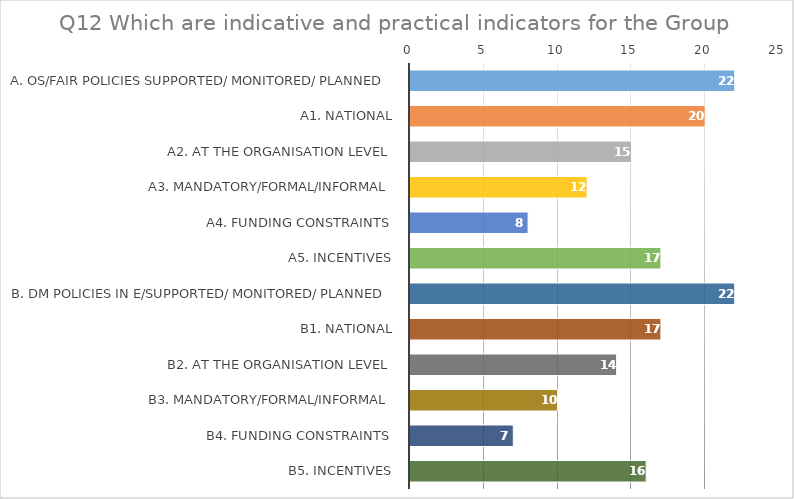
| Category | Series 0 |
|---|---|
| A. OS/FAIR policies supported/ monitored/ planned | 22 |
| a1. National | 20 |
| a2. At the organisation level | 15 |
| a3. Mandatory/formal/informal | 12 |
| a4. Funding constraints | 8 |
| a5. Incentives | 17 |
| B. DM policies in e/supported/ monitored/ planned | 22 |
| b1. National | 17 |
| b2. At the organisation level | 14 |
| b3. Mandatory/formal/informal | 10 |
| b4. Funding constraints | 7 |
| b5. Incentives | 16 |